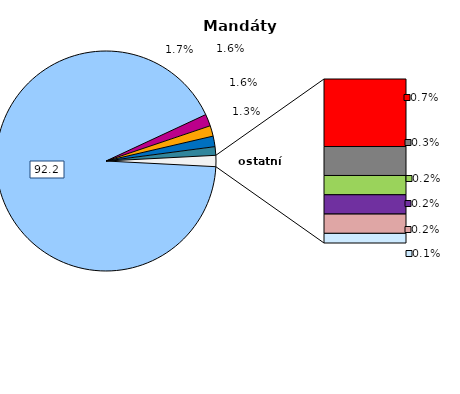
| Category | mandáty |
|---|---|
| NK | 951 |
| KDU-ČSL | 18 |
| ČSSD | 16 |
| ODS | 16 |
| STAN | 13 |
| KSČM | 7 |
| HNHRM | 3 |
| ALTER | 2 |
| TOP 09 | 2 |
| SPOZ | 2 |
| Nestran. | 1 |
| SZ | 0 |
| SD-SN | 0 |